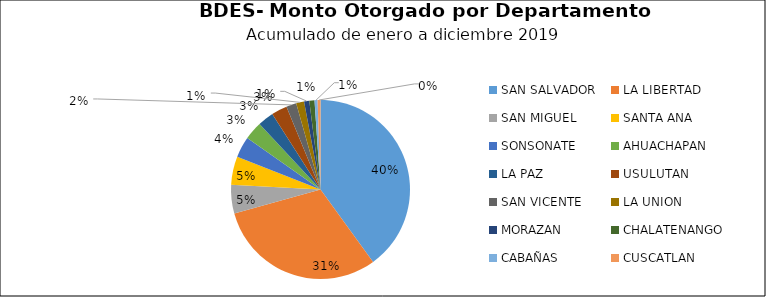
| Category | Monto | Créditos |
|---|---|---|
| SAN SALVADOR | 93.014 | 2228 |
| LA LIBERTAD | 71.285 | 965 |
| SAN MIGUEL | 12.065 | 783 |
| SANTA ANA | 11.88 | 787 |
| SONSONATE | 8.764 | 470 |
| AHUACHAPAN | 7.736 | 382 |
| LA PAZ | 6.674 | 639 |
| USULUTAN | 6.626 | 590 |
| SAN VICENTE | 4.241 | 238 |
| LA UNION | 3.325 | 225 |
| MORAZAN | 2.192 | 335 |
| CHALATENANGO | 2.187 | 59 |
| CABAÑAS | 1.281 | 57 |
| CUSCATLAN | 1.195 | 158 |